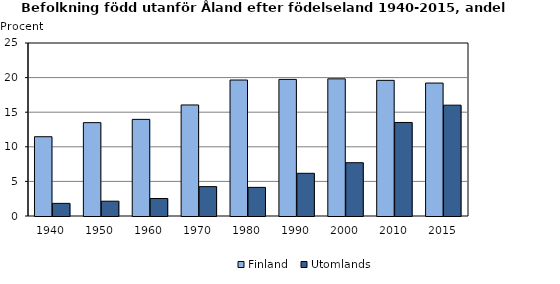
| Category | Finland  | Utomlands |
|---|---|---|
| 1940.0 | 11.455 | 1.826 |
| 1950.0 | 13.49 | 2.139 |
| 1960.0 | 13.965 | 2.526 |
| 1970.0 | 16.046 | 4.244 |
| 1980.0 | 19.651 | 4.135 |
| 1990.0 | 19.741 | 6.17 |
| 2000.0 | 19.821 | 7.701 |
| 2010.0 | 19.602 | 13.514 |
| 2015.0 | 19.211 | 16.016 |